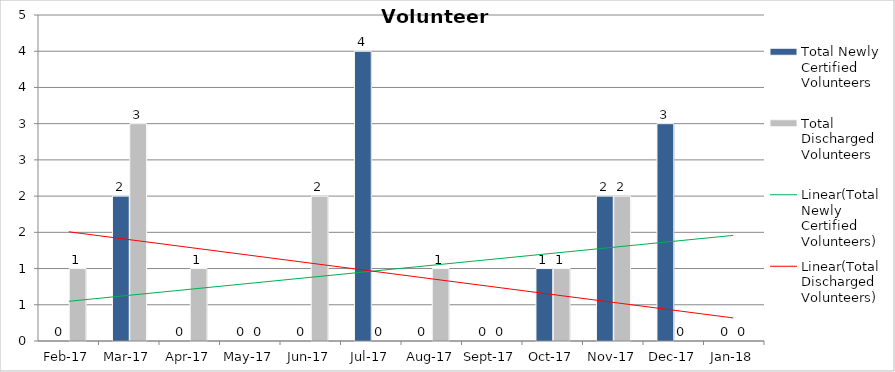
| Category | Total Newly Certified Volunteers | Total Discharged Volunteers |
|---|---|---|
| 2017-02-01 | 0 | 1 |
| 2017-03-01 | 2 | 3 |
| 2017-04-01 | 0 | 1 |
| 2017-05-01 | 0 | 0 |
| 2017-06-01 | 0 | 2 |
| 2017-07-01 | 4 | 0 |
| 2017-08-01 | 0 | 1 |
| 2017-09-01 | 0 | 0 |
| 2017-10-01 | 1 | 1 |
| 2017-11-01 | 2 | 2 |
| 2017-12-01 | 3 | 0 |
| 2018-01-01 | 0 | 0 |